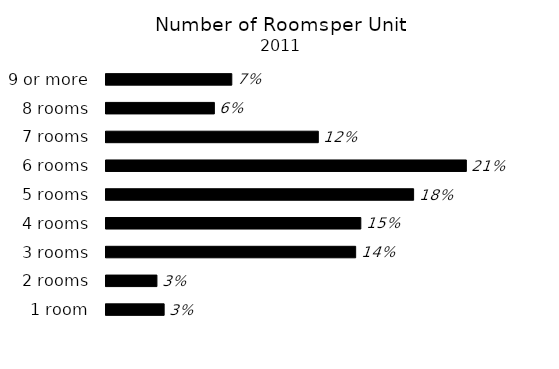
| Category | Series 0 |
|---|---|
| 1 room | 0.034 |
| 2 rooms | 0.029 |
| 3 rooms | 0.144 |
| 4 rooms | 0.147 |
| 5 rooms | 0.178 |
| 6 rooms | 0.209 |
| 7 rooms | 0.123 |
| 8 rooms | 0.063 |
| 9 or more | 0.073 |